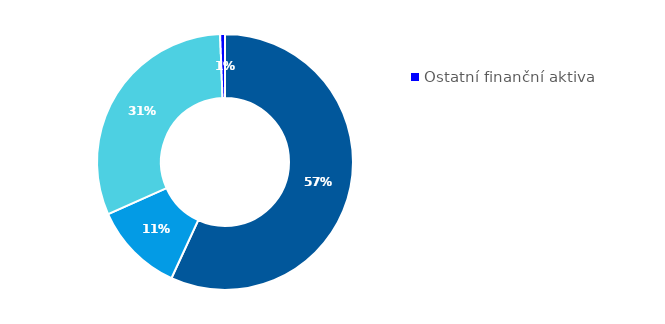
| Category | Series 0 |
|---|---|
| Hotovost | 0.569 |
| Půjčky poskytnuté nemovitostní společnosti | 0.115 |
| Majetkové účasti v nemovitostní společnosti | 0.311 |
| Ostatní finanční aktiva | 0.006 |